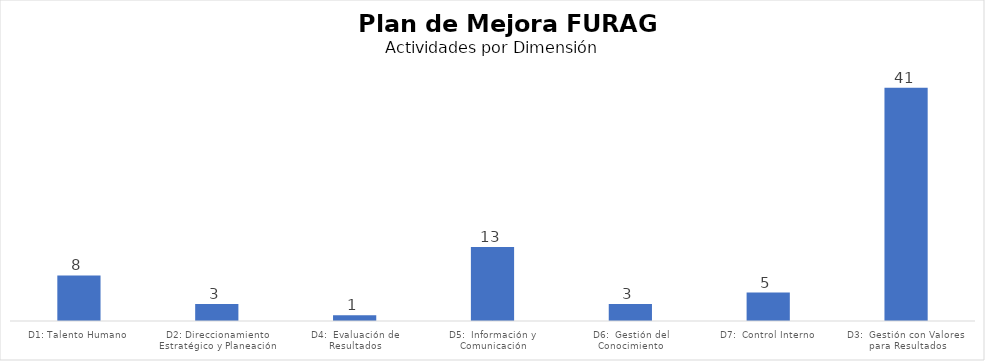
| Category | Cuenta de ACCIÓN A DESARROLLAR |
|---|---|
| D1: Talento Humano | 8 |
| D2: Direccionamiento Estratégico y Planeación | 3 |
| D4:  Evaluación de Resultados | 1 |
| D5:  Información y Comunicación | 13 |
| D6:  Gestión del Conocimiento | 3 |
| D7:  Control Interno | 5 |
| D3:  Gestión con Valores  para Resultados | 41 |